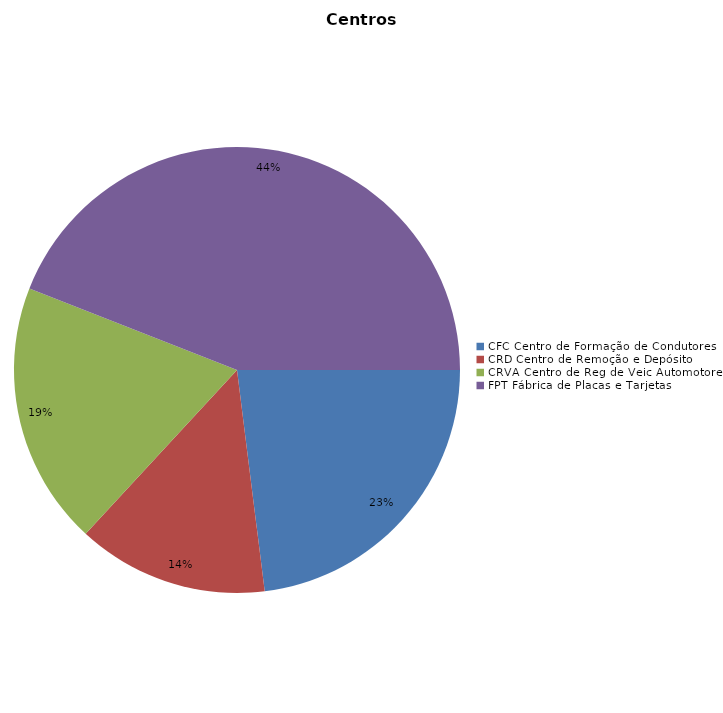
| Category | Últimos 12 Meses |
|---|---|
| CFC Centro de Formação de Condutores | 2670 |
| CRD Centro de Remoção e Depósito | 1607 |
| CRVA Centro de Reg de Veic Automotores | 2213 |
| FPT Fábrica de Placas e Tarjetas | 5110 |